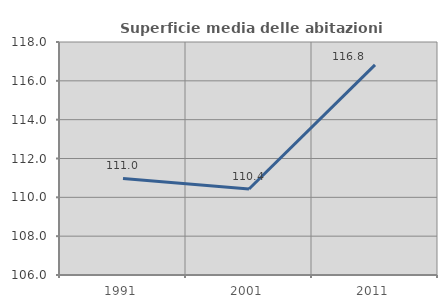
| Category | Superficie media delle abitazioni occupate |
|---|---|
| 1991.0 | 110.974 |
| 2001.0 | 110.43 |
| 2011.0 | 116.825 |